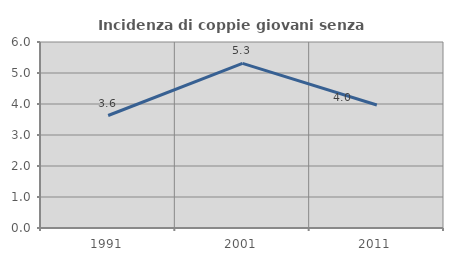
| Category | Incidenza di coppie giovani senza figli |
|---|---|
| 1991.0 | 3.629 |
| 2001.0 | 5.312 |
| 2011.0 | 3.969 |